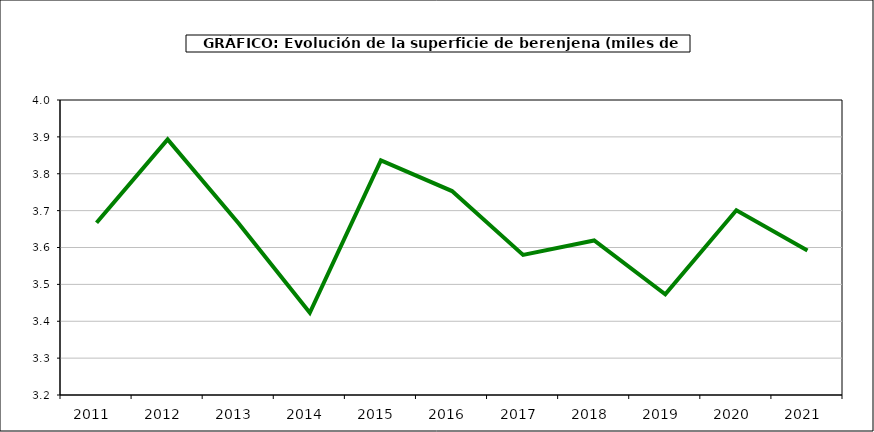
| Category | superficie |
|---|---|
| 2011.0 | 3.667 |
| 2012.0 | 3.893 |
| 2013.0 | 3.665 |
| 2014.0 | 3.423 |
| 2015.0 | 3.836 |
| 2016.0 | 3.753 |
| 2017.0 | 3.58 |
| 2018.0 | 3.619 |
| 2019.0 | 3.473 |
| 2020.0 | 3.701 |
| 2021.0 | 3.592 |